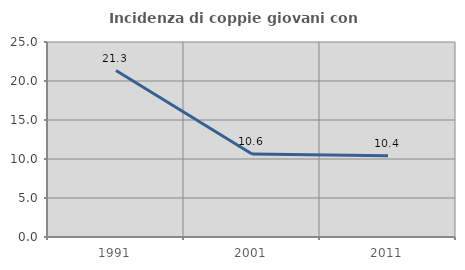
| Category | Incidenza di coppie giovani con figli |
|---|---|
| 1991.0 | 21.338 |
| 2001.0 | 10.629 |
| 2011.0 | 10.417 |